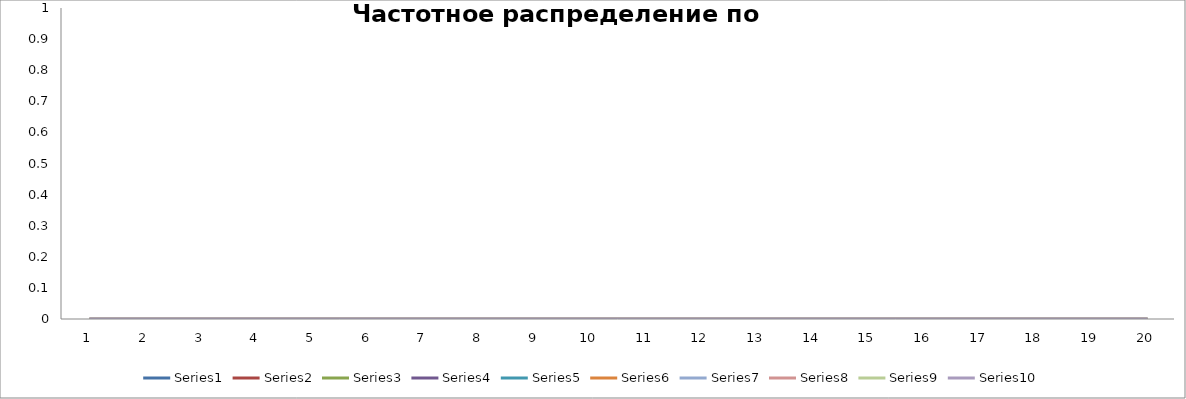
| Category | Series 0 | Series 1 | Series 2 | Series 3 | Series 4 | Series 5 | Series 6 | Series 7 | Series 8 | Series 9 |
|---|---|---|---|---|---|---|---|---|---|---|
| 0 | 0 | 0 | 0 | 0 | 0 | 0 | 0 | 0 | 0 | 0 |
| 1 | 0 | 0 | 0 | 0 | 0 | 0 | 0 | 0 | 0 | 0 |
| 2 | 0 | 0 | 0 | 0 | 0 | 0 | 0 | 0 | 0 | 0 |
| 3 | 0 | 0 | 0 | 0 | 0 | 0 | 0 | 0 | 0 | 0 |
| 4 | 0 | 0 | 0 | 0 | 0 | 0 | 0 | 0 | 0 | 0 |
| 5 | 0 | 0 | 0 | 0 | 0 | 0 | 0 | 0 | 0 | 0 |
| 6 | 0 | 0 | 0 | 0 | 0 | 0 | 0 | 0 | 0 | 0 |
| 7 | 0 | 0 | 0 | 0 | 0 | 0 | 0 | 0 | 0 | 0 |
| 8 | 0 | 0 | 0 | 0 | 0 | 0 | 0 | 0 | 0 | 0 |
| 9 | 0 | 0 | 0 | 0 | 0 | 0 | 0 | 0 | 0 | 0 |
| 10 | 0 | 0 | 0 | 0 | 0 | 0 | 0 | 0 | 0 | 0 |
| 11 | 0 | 0 | 0 | 0 | 0 | 0 | 0 | 0 | 0 | 0 |
| 12 | 0 | 0 | 0 | 0 | 0 | 0 | 0 | 0 | 0 | 0 |
| 13 | 0 | 0 | 0 | 0 | 0 | 0 | 0 | 0 | 0 | 0 |
| 14 | 0 | 0 | 0 | 0 | 0 | 0 | 0 | 0 | 0 | 0 |
| 15 | 0 | 0 | 0 | 0 | 0 | 0 | 0 | 0 | 0 | 0 |
| 16 | 0 | 0 | 0 | 0 | 0 | 0 | 0 | 0 | 0 | 0 |
| 17 | 0 | 0 | 0 | 0 | 0 | 0 | 0 | 0 | 0 | 0 |
| 18 | 0 | 0 | 0 | 0 | 0 | 0 | 0 | 0 | 0 | 0 |
| 19 | 0 | 0 | 0 | 0 | 0 | 0 | 0 | 0 | 0 | 0 |